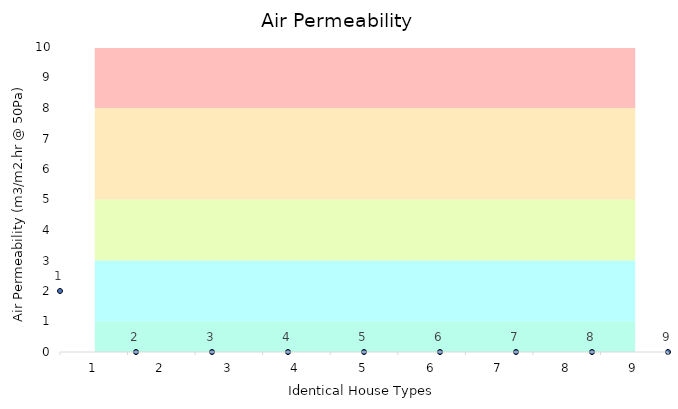
| Category | 0-1 | 0-3 | 3-5 | 5-8 | 8-10 |
|---|---|---|---|---|---|
| 1.0 | 1 | 2 | 2 | 3 | 2 |
| 2.0 | 1 | 2 | 2 | 3 | 2 |
| 3.0 | 1 | 2 | 2 | 3 | 2 |
| 4.0 | 1 | 2 | 2 | 3 | 2 |
| 5.0 | 1 | 2 | 2 | 3 | 2 |
| 6.0 | 1 | 2 | 2 | 3 | 2 |
| 7.0 | 1 | 2 | 2 | 3 | 2 |
| 8.0 | 1 | 2 | 2 | 3 | 2 |
| 9.0 | 1 | 2 | 2 | 3 | 2 |